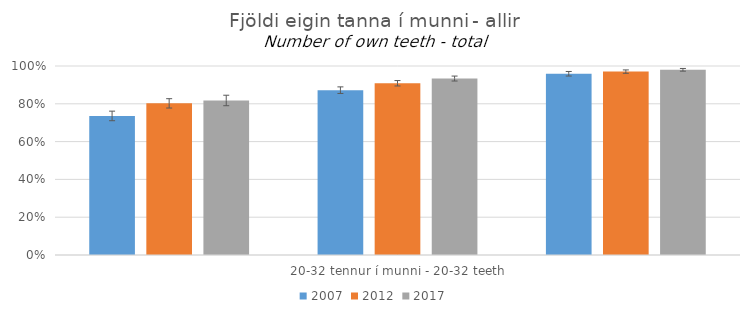
| Category | 2007 | 2012 | 2017 |
|---|---|---|---|
| 0 | 0.736 | 0.802 | 0.818 |
| 1 | 0.872 | 0.909 | 0.934 |
| 2 | 0.959 | 0.97 | 0.98 |